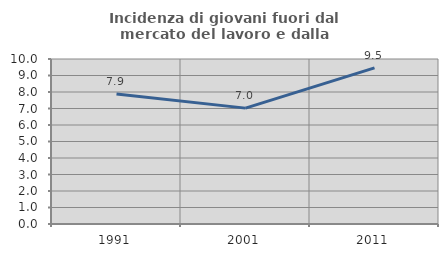
| Category | Incidenza di giovani fuori dal mercato del lavoro e dalla formazione  |
|---|---|
| 1991.0 | 7.882 |
| 2001.0 | 7.023 |
| 2011.0 | 9.461 |